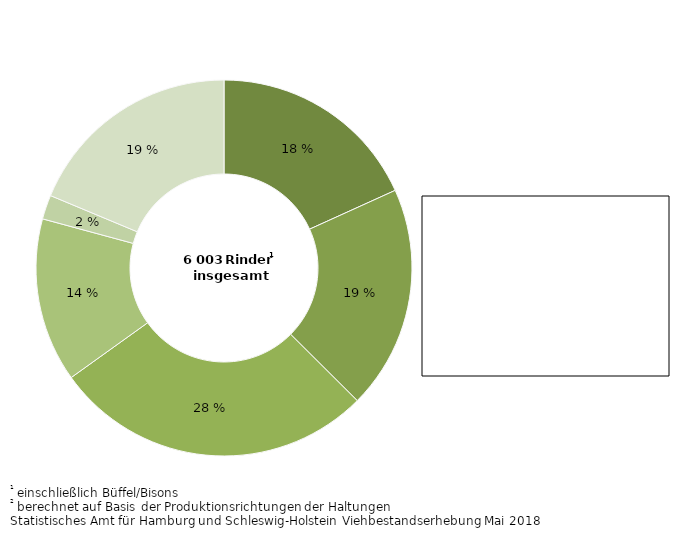
| Category | Series 0 |
|---|---|
| Milchkühe² | 1094 |
| sonstige Kühe² | 1155 |
| Kälber und Jungrinder bis einschließlich 1 Jahr zusammen | 1659 |
| männliche Rinder älter als 1 Jahr | 847 |
| Schlachtfärsen älter als 1 Jahr | 125 |
| Nutz- und Zuchtfärsen älter als 1 Jahr | 1123 |